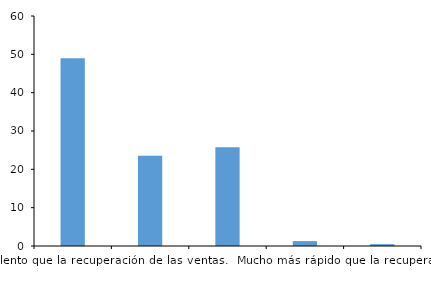
| Category | Series 0 |
|---|---|
| Mucho más lento que la recuperación de las ventas. | 48.96 |
| Levemente más lento que la recuperación de las ventas. | 23.52 |
| Similar a la recuperación de las ventas. | 25.76 |
| Levemente más rápido que la recuperación de las ventas. | 1.28 |
| Mucho más rápido que la recuperación de las ventas. | 0.48 |